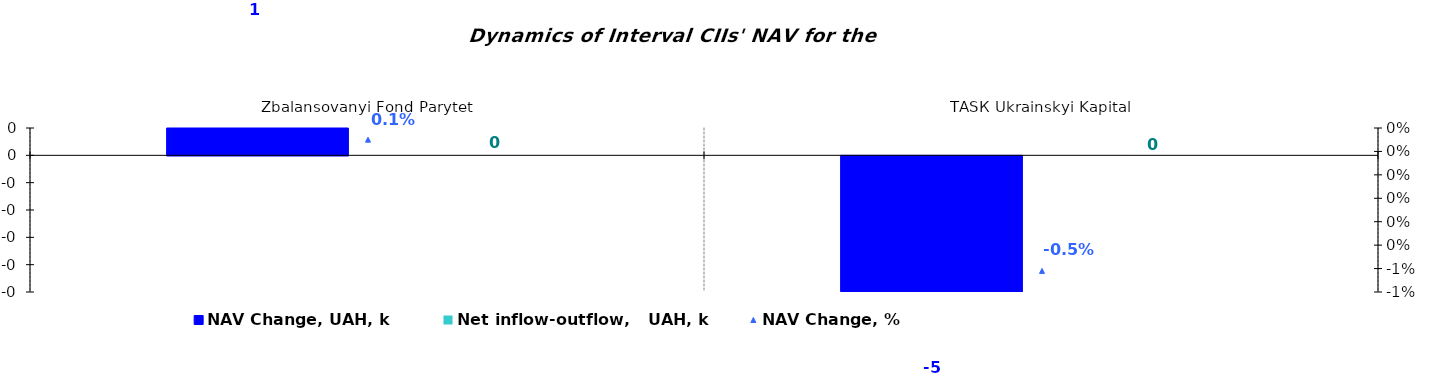
| Category | NAV Change, UAH, k | Net inflow-outflow,   UAH, k |
|---|---|---|
| Zbalansovanyi Fond Parytet | 0.73 | 0 |
| ТАSК Ukrainskyi Kapital | -4.85 | 0 |